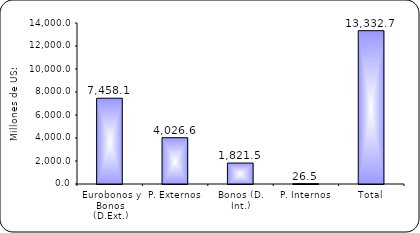
| Category | Series 1 |
|---|---|
| Eurobonos y Bonos (D.Ext.) | 7458.1 |
| P. Externos | 4026.6 |
| Bonos (D. Int.) | 1821.5 |
| P. Internos | 26.5 |
| Total | 13332.7 |